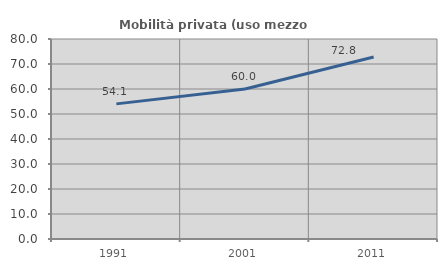
| Category | Mobilità privata (uso mezzo privato) |
|---|---|
| 1991.0 | 54.053 |
| 2001.0 | 59.974 |
| 2011.0 | 72.783 |